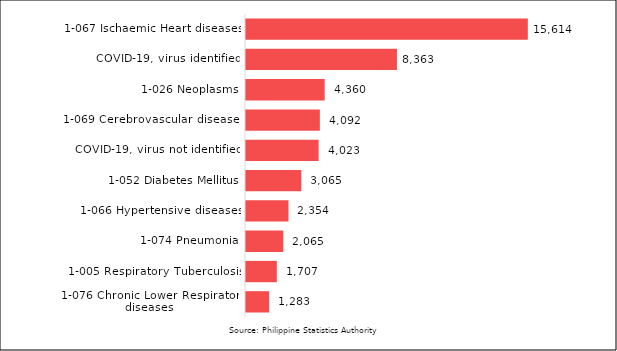
| Category | Series 0 |
|---|---|
| 1-076 Chronic Lower Respiratory diseases | 1283 |
| 1-005 Respiratory Tuberculosis | 1707 |
| 1-074 Pneumonia | 2065 |
| 1-066 Hypertensive diseases | 2354 |
| 1-052 Diabetes Mellitus | 3065 |
| COVID-19, virus not identified | 4023 |
| 1-069 Cerebrovascular diseases | 4092 |
| 1-026 Neoplasms | 4360 |
| COVID-19, virus identified | 8363 |
| 1-067 Ischaemic Heart diseases | 15614 |